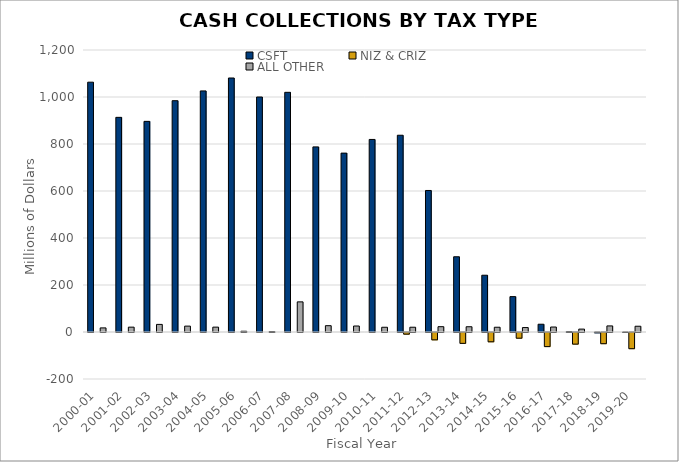
| Category | CSFT | NIZ & CRIZ | ALL OTHER |
|---|---|---|---|
| 2000-01 | 1063.046 | 0 | 17.422 |
| 2001-02 | 913.426 | 0 | 20.65 |
| 2002-03 | 896.329 | 0 | 32.318 |
| 2003-04 | 984.295 | 0 | 25.018 |
| 2004-05 | 1025.904 | 0 | 20.679 |
| 2005-06 | 1080.874 | 0 | 3.202 |
| 2006-07 | 999.954 | 0 | 1.851 |
| 2007-08 | 1019.942 | 0 | 128.237 |
| 2008-09 | 787.704 | 0 | 26.896 |
| 2009-10 | 761.188 | 0 | 25.508 |
| 2010-11 | 819.363 | 0 | 20.154 |
| 2011-12 | 837.243 | -7.113 | 20.329 |
| 2012-13 | 602.249 | -31.288 | 22.614 |
| 2013-14 | 320.207 | -46.23 | 22.361 |
| 2014-15 | 241.587 | -39.621 | 20.234 |
| 2015-16 | 150.58 | -24.262 | 18.916 |
| 2016-17 | 33.051 | -60.009 | 21.181 |
| 2017-18 | 1.822 | -49.526 | 12.304 |
| 2018-19 | -1.254 | -47.66 | 25.906 |
| 2019-20 | 0.078 | -68.895 | 24.513 |